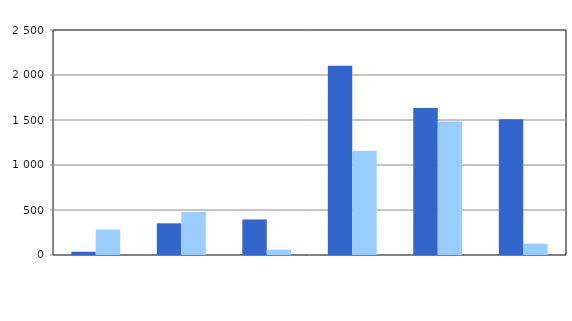
| Category | Series 0 | Series 1 |
|---|---|---|
| 0 | 36 | 283 |
| 1 | 352 | 477 |
| 2 | 395 | 58 |
| 3 | 2103 | 1159 |
| 4 | 1632 | 1484 |
| 5 | 1509 | 126 |